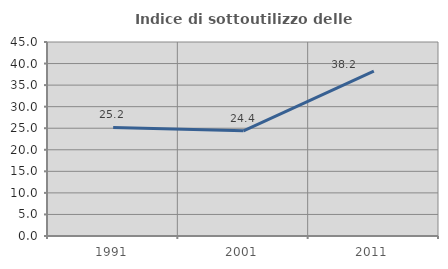
| Category | Indice di sottoutilizzo delle abitazioni  |
|---|---|
| 1991.0 | 25.18 |
| 2001.0 | 24.39 |
| 2011.0 | 38.235 |